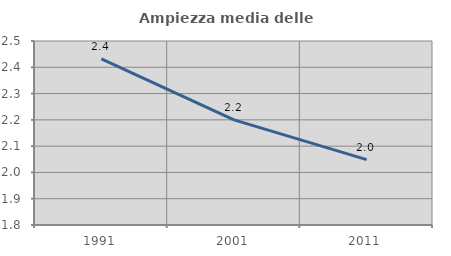
| Category | Ampiezza media delle famiglie |
|---|---|
| 1991.0 | 2.432 |
| 2001.0 | 2.2 |
| 2011.0 | 2.049 |